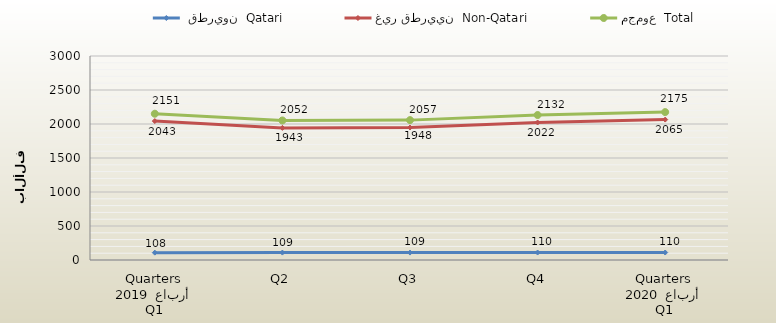
| Category |  قطريون  Qatari | غير قطريين  Non-Qatari | مجموع  Total |
|---|---|---|---|
| 0 | 108 | 2043 | 2151 |
| 1 | 109 | 1943 | 2052 |
| 2 | 109 | 1948 | 2057 |
| 3 | 110 | 2022 | 2132 |
| 4 | 110 | 2065 | 2175 |